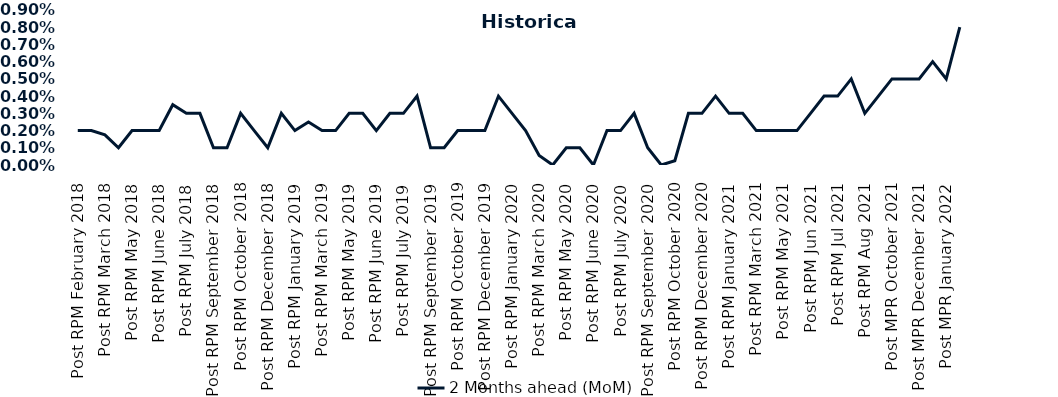
| Category | 2 Months ahead (MoM) |
|---|---|
| Post RPM February 2018 | 0.002 |
| Pre RPM March 2018 | 0.002 |
| Post RPM March 2018 | 0.002 |
| Pre RPM May 2018 | 0.001 |
| Post RPM May 2018 | 0.002 |
| Pre RPM June 2018 | 0.002 |
| Post RPM June 2018 | 0.002 |
| Pre RPM July 2018 | 0.004 |
| Post RPM July 2018 | 0.003 |
| Pre RPM September 2018 | 0.003 |
| Post RPM September 2018 | 0.001 |
| Pre RPM October 2018 | 0.001 |
| Post RPM October 2018 | 0.003 |
| Pre RPM December 2018 | 0.002 |
| Post RPM December 2018 | 0.001 |
| Pre RPM January 2019 | 0.003 |
| Post RPM January 2019 | 0.002 |
| Pre RPM March 2019 | 0.002 |
| Post RPM March 2019 | 0.002 |
| Pre RPM May 2019 | 0.002 |
| Post RPM May 2019 | 0.003 |
| Pre RPM June 2019 | 0.003 |
| Post RPM June 2019 | 0.002 |
| Pre RPM July 2019 | 0.003 |
| Post RPM July 2019 | 0.003 |
| Pre RPM September 2019 | 0.004 |
| Post RPM September 2019 | 0.001 |
| Pre RPM October 2019 | 0.001 |
| Post RPM October 2019 | 0.002 |
| Pre RPM December 2019 | 0.002 |
| Post RPM December 2019 | 0.002 |
| Pre RPM January 2020 | 0.004 |
| Post RPM January 2020 | 0.003 |
| Pre RPM March 2020 | 0.002 |
| Post RPM March 2020 | 0.001 |
| Pre RPM May 2020 | 0 |
| Post RPM May 2020 | 0.001 |
| Pre RPM June 2020 | 0.001 |
| Post RPM June 2020 | 0 |
| Pre RPM July 2020 | 0.002 |
| Post RPM July 2020 | 0.002 |
| Pre RPM September 2020 | 0.003 |
| Post RPM September 2020 | 0.001 |
| Pre RPM October 2020 | 0 |
| Post RPM October 2020 | 0 |
| Pre RPM December 2020 | 0.003 |
|  Post RPM December 2020 | 0.003 |
| Pre RPM January 2021 | 0.004 |
| Post RPM January 2021 | 0.003 |
|  Pre RPM March 2021 | 0.003 |
|  Post RPM March 2021 | 0.002 |
|  Pre RPM May 2021 | 0.002 |
|  Post RPM May 2021 | 0.002 |
|  Pre RPM Jun 2021 | 0.002 |
|   Post RPM Jun 2021 | 0.003 |
| Pre RPM Jul 2021 | 0.004 |
|  Post RPM Jul 2021 | 0.004 |
| Pre RPM Aug 2021 | 0.005 |
|  Post RPM Aug 2021 | 0.003 |
| Pre MPR October 2021 | 0.004 |
| Post MPR October 2021 | 0.005 |
| Pre MPR December 2021 | 0.005 |
| Post MPR December 2021 | 0.005 |
| Pre MPR January 2022 | 0.006 |
| Post MPR January 2022 | 0.005 |
| Pre MPR March 2022 | 0.008 |